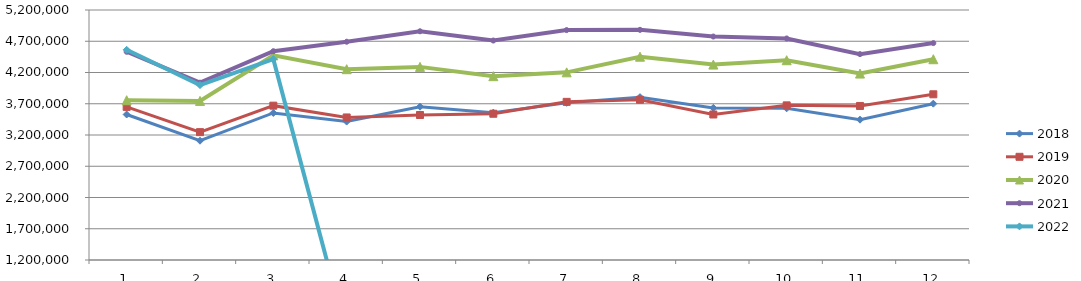
| Category | 2018 | 2019 | 2020 | 2021 | 2022 |
|---|---|---|---|---|---|
| 0 | 3528241.229 | 3649683.28 | 3756283.089 | 4531541.153 | 4563200.653 |
| 1 | 3108555.552 | 3245578.859 | 3745626.569 | 4037286.037 | 3998277.306 |
| 2 | 3553184.371 | 3669368.201 | 4474226.706 | 4540804.564 | 4412666.056 |
| 3 | 3414889.226 | 3480737.518 | 4252877.011 | 4692178.419 | 0 |
| 4 | 3653293.789 | 3520173.393 | 4289935.067 | 4859630.691 | 0 |
| 5 | 3557351.211 | 3540194.304 | 4141054.684 | 4711532.98 | 0 |
| 6 | 3714873.235 | 3730287.221 | 4202654.044 | 4878717.093 | 0 |
| 7 | 3805404.89 | 3764065.715 | 4452839.823 | 4882258.316 | 0 |
| 8 | 3633589.924 | 3528193.213 | 4326562.065 | 4775380.064 | 0 |
| 9 | 3626810.501 | 3674095.651 | 4396335.731 | 4744279.495 | 0 |
| 10 | 3445044.438 | 3664597.161 | 4182792.836 | 4494280.792 | 0 |
| 11 | 3701418.855 | 3851208.606 | 4412374.456 | 4670500.878 | 0 |